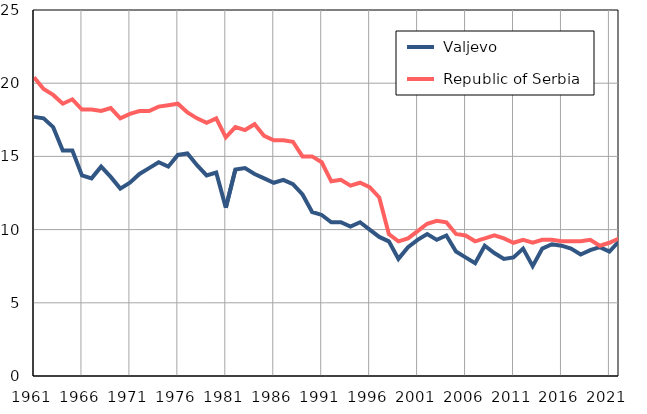
| Category |  Valjevo |  Republic of Serbia |
|---|---|---|
| 1961.0 | 17.7 | 20.4 |
| 1962.0 | 17.6 | 19.6 |
| 1963.0 | 17 | 19.2 |
| 1964.0 | 15.4 | 18.6 |
| 1965.0 | 15.4 | 18.9 |
| 1966.0 | 13.7 | 18.2 |
| 1967.0 | 13.5 | 18.2 |
| 1968.0 | 14.3 | 18.1 |
| 1969.0 | 13.6 | 18.3 |
| 1970.0 | 12.8 | 17.6 |
| 1971.0 | 13.2 | 17.9 |
| 1972.0 | 13.8 | 18.1 |
| 1973.0 | 14.2 | 18.1 |
| 1974.0 | 14.6 | 18.4 |
| 1975.0 | 14.3 | 18.5 |
| 1976.0 | 15.1 | 18.6 |
| 1977.0 | 15.2 | 18 |
| 1978.0 | 14.4 | 17.6 |
| 1979.0 | 13.7 | 17.3 |
| 1980.0 | 13.9 | 17.6 |
| 1981.0 | 11.5 | 16.3 |
| 1982.0 | 14.1 | 17 |
| 1983.0 | 14.2 | 16.8 |
| 1984.0 | 13.8 | 17.2 |
| 1985.0 | 13.5 | 16.4 |
| 1986.0 | 13.2 | 16.1 |
| 1987.0 | 13.4 | 16.1 |
| 1988.0 | 13.1 | 16 |
| 1989.0 | 12.4 | 15 |
| 1990.0 | 11.2 | 15 |
| 1991.0 | 11 | 14.6 |
| 1992.0 | 10.5 | 13.3 |
| 1993.0 | 10.5 | 13.4 |
| 1994.0 | 10.2 | 13 |
| 1995.0 | 10.5 | 13.2 |
| 1996.0 | 10 | 12.9 |
| 1997.0 | 9.5 | 12.2 |
| 1998.0 | 9.2 | 9.7 |
| 1999.0 | 8 | 9.2 |
| 2000.0 | 8.8 | 9.4 |
| 2001.0 | 9.3 | 9.9 |
| 2002.0 | 9.7 | 10.4 |
| 2003.0 | 9.3 | 10.6 |
| 2004.0 | 9.6 | 10.5 |
| 2005.0 | 8.5 | 9.7 |
| 2006.0 | 8.1 | 9.6 |
| 2007.0 | 7.7 | 9.2 |
| 2008.0 | 8.9 | 9.4 |
| 2009.0 | 8.4 | 9.6 |
| 2010.0 | 8 | 9.4 |
| 2011.0 | 8.1 | 9.1 |
| 2012.0 | 8.7 | 9.3 |
| 2013.0 | 7.5 | 9.1 |
| 2014.0 | 8.7 | 9.3 |
| 2015.0 | 9 | 9.3 |
| 2016.0 | 8.9 | 9.2 |
| 2017.0 | 8.7 | 9.2 |
| 2018.0 | 8.3 | 9.2 |
| 2019.0 | 8.6 | 9.3 |
| 2020.0 | 8.8 | 8.9 |
| 2021.0 | 8.5 | 9.1 |
| 2022.0 | 9.2 | 9.4 |